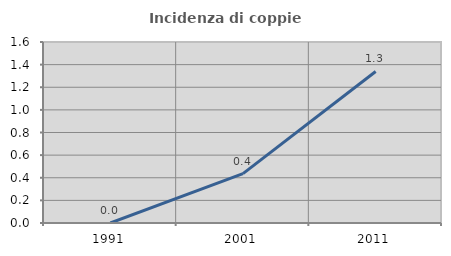
| Category | Incidenza di coppie miste |
|---|---|
| 1991.0 | 0 |
| 2001.0 | 0.437 |
| 2011.0 | 1.339 |